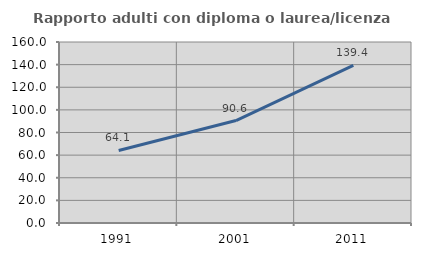
| Category | Rapporto adulti con diploma o laurea/licenza media  |
|---|---|
| 1991.0 | 64.099 |
| 2001.0 | 90.555 |
| 2011.0 | 139.361 |